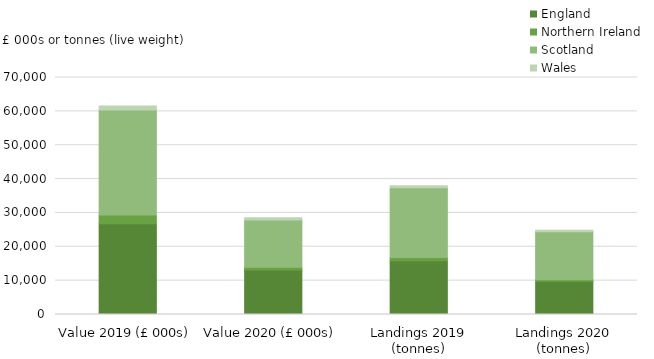
| Category | England | Northern Ireland | Scotland | Wales |
|---|---|---|---|---|
| 0 | 26779.349 | 2619.328 | 31025.291 | 1147.796 |
| 1 | 13177.876 | 754.741 | 13999.652 | 647.197 |
| 2 | 15900.911 | 957.759 | 20578.898 | 557.633 |
| 3 | 9837.323 | 421.84 | 14186.904 | 432.295 |